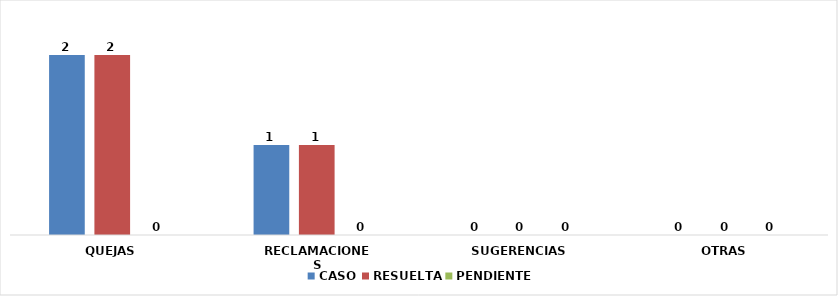
| Category | CASO | RESUELTA | PENDIENTE |
|---|---|---|---|
| QUEJAS | 2 | 2 | 0 |
| RECLAMACIONES | 1 | 1 | 0 |
| SUGERENCIAS | 0 | 0 | 0 |
| OTRAS | 0 | 0 | 0 |